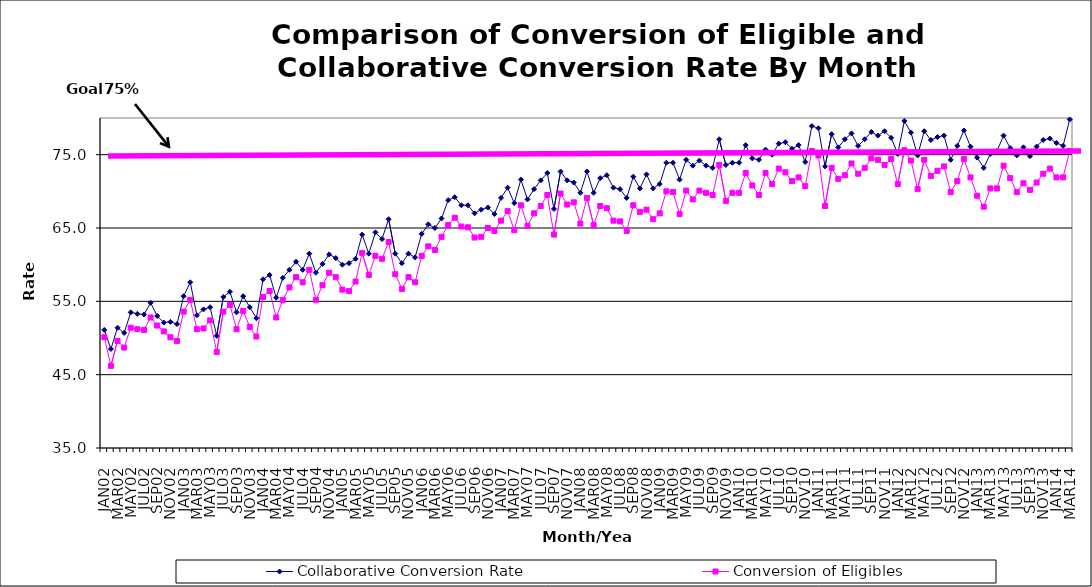
| Category | Collaborative Conversion Rate | Conversion of Eligibles |
|---|---|---|
| JAN02 | 51.1 | 50.1 |
| FEB02 | 48.5 | 46.2 |
| MAR02 | 51.4 | 49.6 |
| APR02 | 50.7 | 48.7 |
| MAY02 | 53.5 | 51.4 |
| JUN02 | 53.3 | 51.2 |
| JUL02 | 53.2 | 51.1 |
| AUG02 | 54.8 | 52.8 |
| SEP02 | 53 | 51.7 |
| OCT02 | 52.1 | 50.9 |
| NOV02 | 52.2 | 50.1 |
| DEC02 | 51.9 | 49.6 |
| JAN03 | 55.7 | 53.6 |
| FEB03 | 57.6 | 55.2 |
| MAR03 | 53.1 | 51.2 |
| APR03 | 53.9 | 51.3 |
| MAY03 | 54.2 | 52.4 |
| JUN03 | 50.3 | 48.1 |
| JUL03 | 55.6 | 53.6 |
| AUG03 | 56.3 | 54.5 |
| SEP03 | 53.5 | 51.2 |
| OCT03 | 55.7 | 53.7 |
| NOV03 | 54.2 | 51.5 |
| DEC03 | 52.7 | 50.2 |
| JAN04 | 58 | 55.6 |
| FEB04 | 58.6 | 56.4 |
| MAR04 | 55.5 | 52.8 |
| APR04 | 58.2 | 55.2 |
| MAY04 | 59.3 | 56.9 |
| JUN04 | 60.4 | 58.3 |
| JUL04 | 59.3 | 57.6 |
| AUG04 | 61.5 | 59.3 |
| SEP04 | 58.9 | 55.2 |
| OCT04 | 60.1 | 57.2 |
| NOV04 | 61.4 | 58.9 |
| DEC04 | 60.9 | 58.3 |
| JAN05 | 60 | 56.6 |
| FEB05 | 60.2 | 56.4 |
| MAR05 | 60.8 | 57.7 |
| APR05 | 64.1 | 61.6 |
| MAY05 | 61.5 | 58.6 |
| JUN05 | 64.4 | 61.2 |
| JUL05 | 63.5 | 60.8 |
| AUG05 | 66.2 | 63.1 |
| SEP05 | 61.5 | 58.7 |
| OCT05 | 60.2 | 56.7 |
| NOV05 | 61.5 | 58.3 |
| DEC05 | 61 | 57.6 |
| JAN06 | 64.2 | 61.2 |
| FEB06 | 65.5 | 62.5 |
| MAR06 | 65 | 62 |
| APR06 | 66.3 | 63.8 |
| MAY06 | 68.8 | 65.4 |
| JUN06 | 69.2 | 66.4 |
| JUL06 | 68.1 | 65.2 |
| AUG06 | 68.1 | 65.1 |
| SEP06 | 67 | 63.7 |
| OCT06 | 67.5 | 63.8 |
| NOV06 | 67.8 | 65 |
| DEC06 | 66.9 | 64.6 |
| JAN07 | 69.1 | 66 |
| FEB07 | 70.5 | 67.3 |
| MAR07 | 68.4 | 64.7 |
| APR07 | 71.6 | 68.1 |
| MAY07 | 68.9 | 65.3 |
| JUN07 | 70.3 | 67 |
| JUL07 | 71.5 | 68 |
| AUG07 | 72.5 | 69.5 |
| SEP07 | 67.6 | 64.1 |
| OCT07 | 72.7 | 69.7 |
| NOV07 | 71.5 | 68.2 |
| DEC07 | 71.2 | 68.5 |
| JAN08 | 69.8 | 65.6 |
| FEB08 | 72.7 | 69.1 |
| MAR08 | 69.8 | 65.4 |
| APR08 | 71.8 | 68 |
| MAY08 | 72.2 | 67.7 |
| JUN08 | 70.5 | 66 |
| JUL08 | 70.3 | 65.9 |
| AUG08 | 69.1 | 64.6 |
| SEP08 | 72 | 68.1 |
| OCT08 | 70.4 | 67.2 |
| NOV08 | 72.3 | 67.5 |
| DEC08 | 70.4 | 66.2 |
| JAN09 | 71 | 67 |
| FEB09 | 73.9 | 70 |
| MAR09 | 73.9 | 69.9 |
| APR09 | 71.6 | 66.9 |
| MAY09 | 74.3 | 70.1 |
| JUN09 | 73.5 | 68.9 |
| JUL09 | 74.2 | 70.1 |
| AUG09 | 73.5 | 69.8 |
| SEP09 | 73.2 | 69.5 |
| OCT09 | 77.1 | 73.6 |
| NOV09 | 73.6 | 68.7 |
| DEC09 | 73.9 | 69.8 |
| JAN10 | 73.9 | 69.8 |
| FEB10 | 76.3 | 72.5 |
| MAR10 | 74.5 | 70.8 |
| APR10 | 74.3 | 69.5 |
| MAY10 | 75.7 | 72.5 |
| JUN10 | 75 | 71 |
| JUL10 | 76.5 | 73.1 |
| AUG10 | 76.7 | 72.6 |
| SEP10 | 75.8 | 71.4 |
| OCT10 | 76.3 | 71.9 |
| NOV10 | 74 | 70.7 |
| DEC10 | 78.9 | 75.5 |
| JAN11 | 78.6 | 74.9 |
| FEB11 | 73.4 | 68 |
| MAR11 | 77.8 | 73.2 |
| APR11 | 76 | 71.7 |
| MAY11 | 77.1 | 72.2 |
| JUN11 | 77.9 | 73.8 |
| JUL11 | 76.2 | 72.4 |
| AUG11 | 77.1 | 73.2 |
| SEP11 | 78.1 | 74.5 |
| OCT11 | 77.6 | 74.3 |
| NOV11 | 78.2 | 73.6 |
| DEC11 | 77.3 | 74.4 |
| JAN12 | 75.1 | 71 |
| FEB12 | 79.6 | 75.6 |
| MAR12 | 78 | 74.2 |
| APR12 | 74.9 | 70.3 |
| MAY12 | 78.2 | 74.3 |
| JUN12 | 77 | 72.1 |
| JUL12 | 77.4 | 72.8 |
| AUG12 | 77.6 | 73.4 |
| SEP12 | 74.3 | 69.9 |
| OCT12 | 76.2 | 71.4 |
| NOV12 | 78.3 | 74.4 |
| DEC12 | 76.1 | 71.9 |
| JAN13 | 74.6 | 69.4 |
| FEB13 | 73.2 | 67.9 |
| MAR13 | 75.1 | 70.4 |
| APR13 | 75.5 | 70.4 |
| MAY13 | 77.6 | 73.5 |
| JUN13 | 75.9 | 71.8 |
| JUL13 | 74.9 | 69.9 |
| AUG13 | 76 | 71.1 |
| SEP13 | 74.8 | 70.2 |
| OCT13 | 76.1 | 71.2 |
| NOV13 | 77 | 72.4 |
| DEC13 | 77.2 | 73.1 |
| JAN14 | 76.6 | 71.9 |
| FEB14 | 76.2 | 71.9 |
| MAR14 | 79.8 | 75.5 |